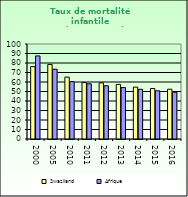
| Category | Swaziland | Afrique                        |
|---|---|---|
| 2000.0 | 76.2 | 87.462 |
| 2005.0 | 78.5 | 73.418 |
| 2010.0 | 65.1 | 60.345 |
| 2011.0 | 59.4 | 58.107 |
| 2012.0 | 59.1 | 56.032 |
| 2013.0 | 57.5 | 54.131 |
| 2014.0 | 54.6 | 52.336 |
| 2015.0 | 53.1 | 50.754 |
| 2016.0 | 52.4 | 49.283 |